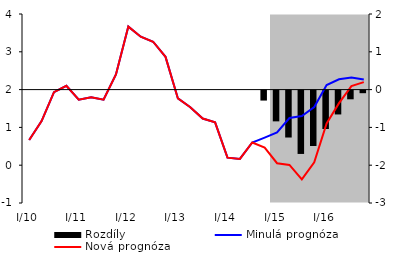
| Category | Rozdíly |
|---|---|
| 0 | 0 |
| 1 | 0 |
| 2 | 0 |
| 3 | 0 |
| 4 | 0 |
| 5 | 0 |
| 6 | 0 |
| 7 | 0 |
| 8 | 0 |
| 9 | 0 |
| 10 | 0 |
| 11 | 0 |
| 12 | 0 |
| 13 | 0 |
| 14 | 0 |
| 15 | 0 |
| 16 | 0 |
| 17 | 0 |
| 18 | 0 |
| 19 | -0.264 |
| 20 | -0.814 |
| 21 | -1.241 |
| 22 | -1.676 |
| 23 | -1.466 |
| 24 | -1.016 |
| 25 | -0.631 |
| 26 | -0.23 |
| 27 | -0.068 |